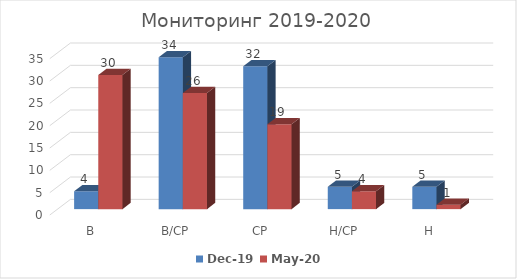
| Category | дек.19 | май.20 |
|---|---|---|
| В | 4 | 30 |
| В/СР | 34 | 26 |
| СР | 32 | 19 |
| Н/СР | 5 | 4 |
| Н | 5 | 1 |